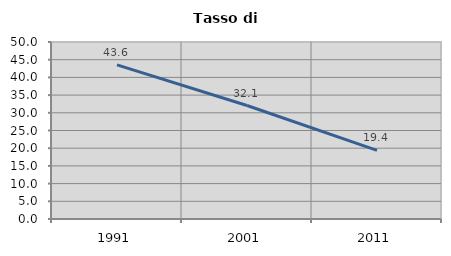
| Category | Tasso di disoccupazione   |
|---|---|
| 1991.0 | 43.555 |
| 2001.0 | 32.06 |
| 2011.0 | 19.39 |